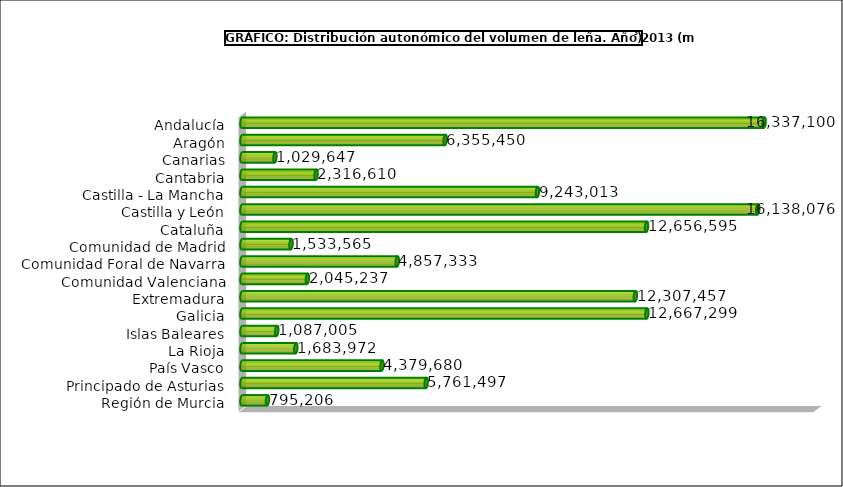
| Category | Series 0 |
|---|---|
| Andalucía | 16337100 |
| Aragón | 6355450 |
| Canarias | 1029647 |
| Cantabria | 2316610 |
| Castilla - La Mancha | 9243013 |
| Castilla y León | 16138076 |
| Cataluña | 12656594.555 |
| Comunidad de Madrid | 1533565 |
| Comunidad Foral de Navarra | 4857333 |
| Comunidad Valenciana | 2045237 |
| Extremadura | 12307457 |
| Galicia | 12667299 |
| Islas Baleares | 1087005 |
| La Rioja | 1683972 |
| País Vasco | 4379680 |
| Principado de Asturias | 5761497 |
| Región de Murcia | 795206 |